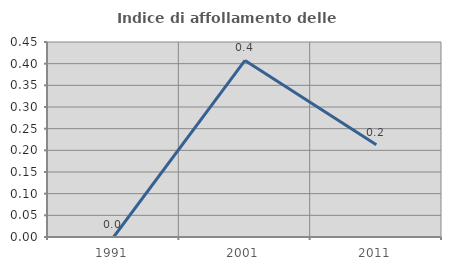
| Category | Indice di affollamento delle abitazioni  |
|---|---|
| 1991.0 | 0 |
| 2001.0 | 0.407 |
| 2011.0 | 0.213 |